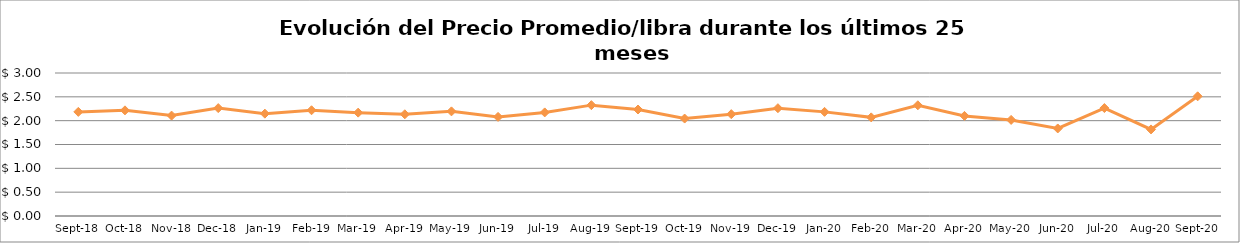
| Category | Series 0 |
|---|---|
| 2018-09-01 | 2.184 |
| 2018-10-01 | 2.216 |
| 2018-11-01 | 2.106 |
| 2018-12-01 | 2.264 |
| 2019-01-01 | 2.147 |
| 2019-02-01 | 2.218 |
| 2019-03-01 | 2.169 |
| 2019-04-01 | 2.134 |
| 2019-05-01 | 2.195 |
| 2019-06-01 | 2.079 |
| 2019-07-01 | 2.173 |
| 2019-08-01 | 2.326 |
| 2019-09-01 | 2.234 |
| 2019-10-01 | 2.044 |
| 2019-11-01 | 2.137 |
| 2019-12-01 | 2.262 |
| 2020-01-01 | 2.185 |
| 2020-02-01 | 2.069 |
| 2020-03-01 | 2.323 |
| 2020-04-01 | 2.1 |
| 2020-05-01 | 2.016 |
| 2020-06-01 | 1.837 |
| 2020-07-01 | 2.265 |
| 2020-08-01 | 1.816 |
| 2020-09-01 | 2.511 |